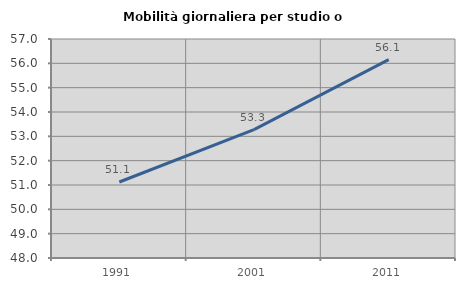
| Category | Mobilità giornaliera per studio o lavoro |
|---|---|
| 1991.0 | 51.124 |
| 2001.0 | 53.274 |
| 2011.0 | 56.15 |